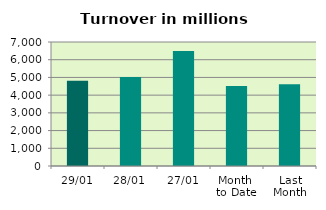
| Category | Series 0 |
|---|---|
| 29/01 | 4808.996 |
| 28/01 | 5027.16 |
| 27/01 | 6495.075 |
| Month 
to Date | 4513.806 |
| Last
Month | 4613.793 |